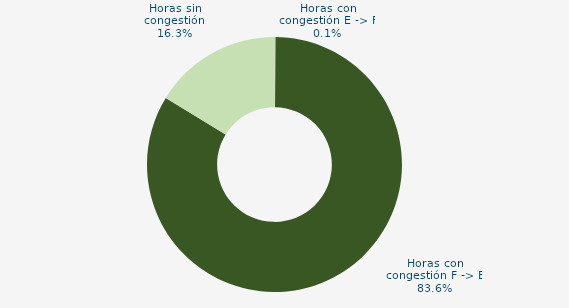
| Category | Horas con congestión E -> F |
|---|---|
| Horas con congestión E -> F | 0.139 |
| Horas con congestión F -> E | 83.611 |
| Horas sin congestión | 16.25 |